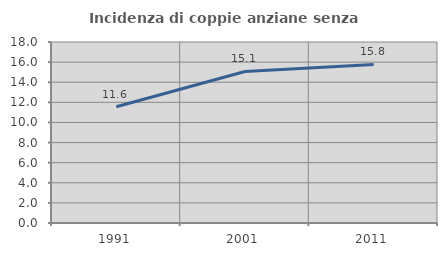
| Category | Incidenza di coppie anziane senza figli  |
|---|---|
| 1991.0 | 11.567 |
| 2001.0 | 15.066 |
| 2011.0 | 15.773 |